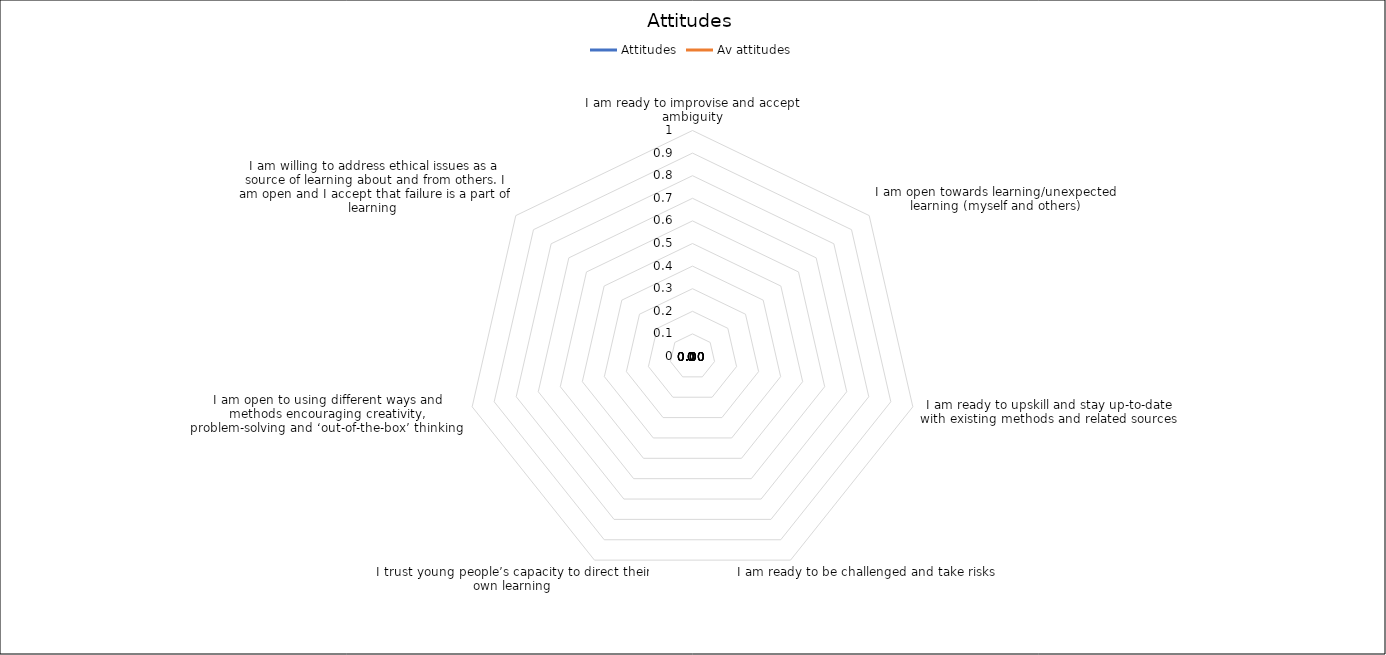
| Category | Attitudes | Av attitudes |
|---|---|---|
| I am ready to improvise and accept ambiguity | 0 | 0 |
| I am open towards learning/unexpected learning (myself and others) | 0 | 0 |
| I am ready to upskill and stay up-to-date with existing methods and related sources | 0 | 0 |
| I am ready to be challenged and take risks | 0 | 0 |
| I trust young people’s capacity to direct their own learning | 0 | 0 |
| I am open to using different ways and methods encouraging creativity, problem-solving and ‘out-of-the-box’ thinking | 0 | 0 |
| I am willing to address ethical issues as a source of learning about and from others. I am open and I accept that failure is a part of learning  | 0 | 0 |